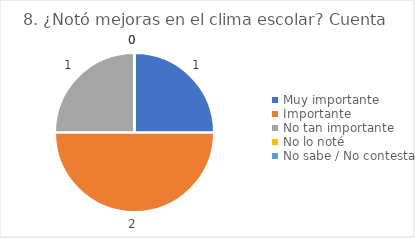
| Category | 8. ¿Notó mejoras en el clima escolar? |
|---|---|
| Muy importante  | 0.25 |
| Importante  | 0.5 |
| No tan importante  | 0.25 |
| No lo noté  | 0 |
| No sabe / No contesta | 0 |